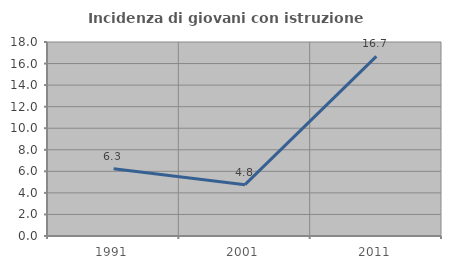
| Category | Incidenza di giovani con istruzione universitaria |
|---|---|
| 1991.0 | 6.25 |
| 2001.0 | 4.762 |
| 2011.0 | 16.667 |